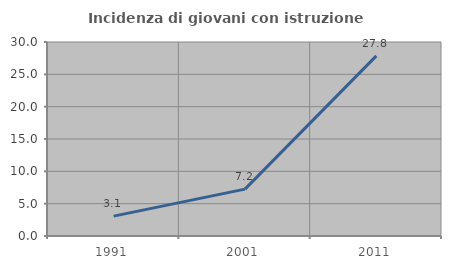
| Category | Incidenza di giovani con istruzione universitaria |
|---|---|
| 1991.0 | 3.077 |
| 2001.0 | 7.246 |
| 2011.0 | 27.848 |